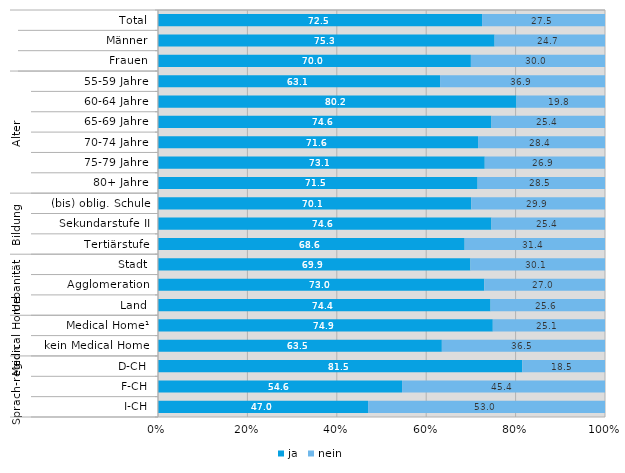
| Category | ja | nein |
|---|---|---|
| 0 | 72.5 | 27.5 |
| 1 | 75.3 | 24.7 |
| 2 | 70 | 30 |
| 3 | 63.1 | 36.9 |
| 4 | 80.2 | 19.8 |
| 5 | 74.6 | 25.4 |
| 6 | 71.6 | 28.4 |
| 7 | 73.1 | 26.9 |
| 8 | 71.5 | 28.5 |
| 9 | 70.1 | 29.9 |
| 10 | 74.6 | 25.4 |
| 11 | 68.6 | 31.4 |
| 12 | 69.9 | 30.1 |
| 13 | 73 | 27 |
| 14 | 74.4 | 25.6 |
| 15 | 74.9 | 25.1 |
| 16 | 63.5 | 36.5 |
| 17 | 81.5 | 18.5 |
| 18 | 54.6 | 45.4 |
| 19 | 47 | 53 |